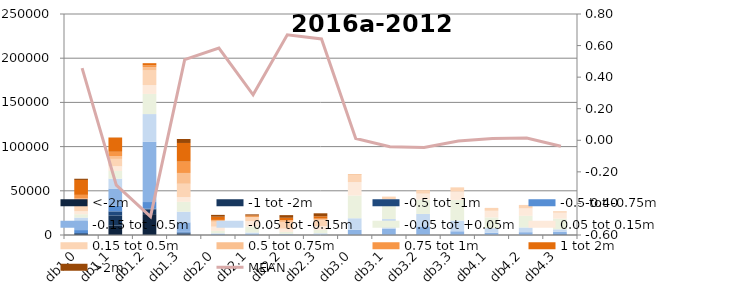
| Category | <-2m | -1 tot -2m | -0.5 tot -1m | -0.5 tot -0.75m | -0.15 tot -0.5m | -0.05 tot -0.15m | -0.05 tot +0.05m | 0.05 tot 0.15m | 0.15 tot 0.5m | 0.5 tot 0.75m | 0.75 tot 1m | 1 tot 2m | >2m |
|---|---|---|---|---|---|---|---|---|---|---|---|---|---|
| db1.0 | 0 | 1250 | 953 | 3376 | 10186 | 3912 | 3837 | 3373 | 9445 | 4883 | 4175 | 16872 | 1371 |
| db1.1 | 10662 | 11457 | 4644 | 6182 | 19601 | 11209 | 8612 | 5414 | 8282 | 3274 | 4806 | 16072 | 94 |
| db1.2 | 23598 | 5434 | 817 | 7445 | 68040 | 31462 | 22791 | 10003 | 16476 | 3848 | 1973 | 2470 | 13 |
| db1.3 | 53 | 1717 | 987 | 1280 | 10254 | 12105 | 11147 | 5336 | 15071 | 12227 | 12805 | 21130 | 4493 |
| db2.0 | 0 | 12 | 167 | 261 | 711 | 771 | 2744 | 4763 | 5530 | 1213 | 888 | 3630 | 2072 |
| db2.1 | 0 | 0 | 20 | 103 | 936 | 1728 | 6779 | 6123 | 4088 | 673 | 410 | 1361 | 1120 |
| db2.2 | 0 | 25 | 125 | 130 | 459 | 653 | 2066 | 3711 | 7543 | 1577 | 692 | 2488 | 3005 |
| db2.3 | 6 | 23 | 17 | 28 | 600 | 1274 | 3857 | 4302 | 6515 | 1145 | 828 | 2559 | 3397 |
| db3.0 | 111 | 123 | 81 | 211 | 5554 | 12865 | 25685 | 15189 | 8420 | 397 | 100 | 144 | 18 |
| db3.1 | 0 | 19 | 93 | 420 | 6695 | 10828 | 16041 | 6398 | 2866 | 60 | 4 | 1 | 0 |
| db3.2 | 0 | 16 | 76 | 486 | 9158 | 14119 | 16129 | 6783 | 3965 | 157 | 42 | 13 | 0 |
| db3.3 | 0 | 70 | 72 | 167 | 3926 | 12086 | 23356 | 9489 | 4595 | 117 | 30 | 10 | 2 |
| db4.1 | 0 | 38 | 35 | 92 | 2465 | 5092 | 12143 | 7524 | 3179 | 78 | 22 | 12 | 0 |
| db4.2 | 1 | 40 | 37 | 112 | 3003 | 5364 | 13143 | 8408 | 3745 | 124 | 33 | 12 | 0 |
| db4.3 | 17 | 91 | 387 | 1402 | 1859 | 2668 | 12095 | 6715 | 1618 | 80 | 28 | 6 | 0 |